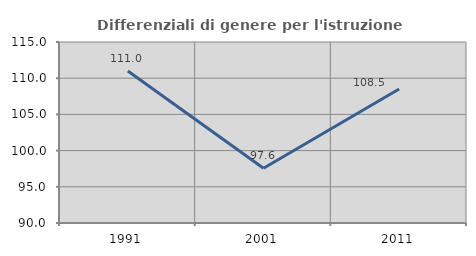
| Category | Differenziali di genere per l'istruzione superiore |
|---|---|
| 1991.0 | 111.005 |
| 2001.0 | 97.567 |
| 2011.0 | 108.5 |